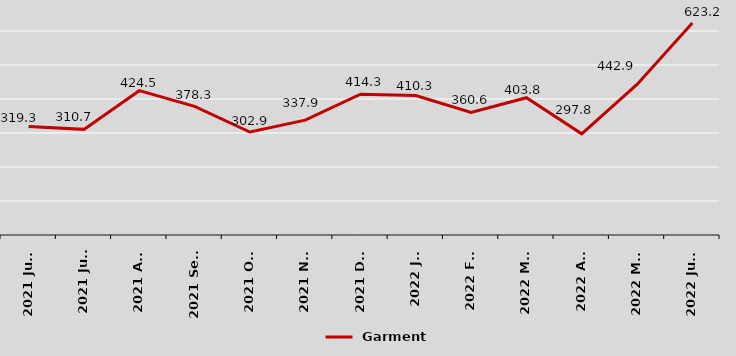
| Category |  Garment |
|---|---|
| 2021 June | 319.3 |
| 2021 July | 310.7 |
| 2021 Aug | 424.5 |
| 2021 Sept | 378.3 |
| 2021 Oct | 302.9 |
| 2021 Nov | 337.9 |
| 2021 Dec | 414.3 |
| 2022 Jan | 410.3 |
| 2022 Feb | 360.6 |
| 2022 Mar | 403.8 |
| 2022 Apr | 297.8 |
| 2022 May | 442.9 |
| 2022 June | 623.2 |